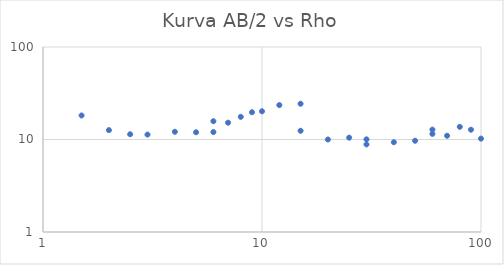
| Category | Series 0 |
|---|---|
| 1.5 | 18.191 |
| 2.0 | 12.627 |
| 2.5 | 11.401 |
| 3.0 | 11.302 |
| 4.0 | 12.113 |
| 5.0 | 11.98 |
| 6.0 | 12.034 |
| 6.0 | 15.763 |
| 7.0 | 15.192 |
| 8.0 | 17.572 |
| 9.0 | 19.711 |
| 10.0 | 20.193 |
| 12.0 | 23.55 |
| 15.0 | 24.355 |
| 15.0 | 12.427 |
| 20.0 | 9.999 |
| 25.0 | 10.466 |
| 30.0 | 10.043 |
| 30.0 | 8.842 |
| 40.0 | 9.344 |
| 50.0 | 9.692 |
| 60.0 | 11.5 |
| 60.0 | 12.793 |
| 70.0 | 10.978 |
| 80.0 | 13.704 |
| 90.0 | 12.753 |
| 100.0 | 10.221 |